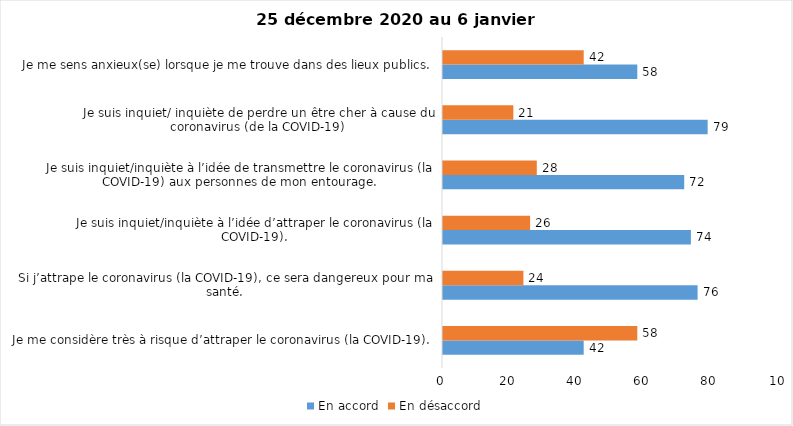
| Category | En accord | En désaccord |
|---|---|---|
| Je me considère très à risque d’attraper le coronavirus (la COVID-19). | 42 | 58 |
| Si j’attrape le coronavirus (la COVID-19), ce sera dangereux pour ma santé. | 76 | 24 |
| Je suis inquiet/inquiète à l’idée d’attraper le coronavirus (la COVID-19). | 74 | 26 |
| Je suis inquiet/inquiète à l’idée de transmettre le coronavirus (la COVID-19) aux personnes de mon entourage. | 72 | 28 |
| Je suis inquiet/ inquiète de perdre un être cher à cause du coronavirus (de la COVID-19) | 79 | 21 |
| Je me sens anxieux(se) lorsque je me trouve dans des lieux publics. | 58 | 42 |